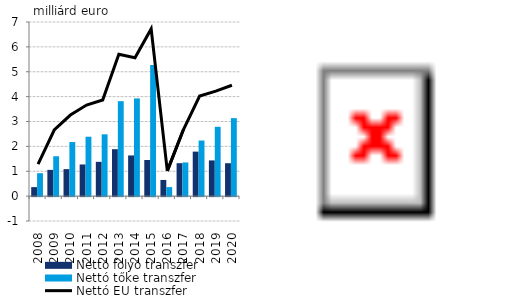
| Category | Nettó folyó transzfer | Nettó tőke transzfer |
|---|---|---|
| 2008.0 | 0.362 | 0.921 |
| 2009.0 | 1.055 | 1.603 |
| 2010.0 | 1.085 | 2.174 |
| 2011.0 | 1.273 | 2.387 |
| 2012.0 | 1.378 | 2.484 |
| 2013.0 | 1.887 | 3.817 |
| 2014.0 | 1.635 | 3.928 |
| 2015.0 | 1.452 | 5.271 |
| 2016.0 | 0.65 | 0.363 |
| 2017.0 | 1.325 | 1.353 |
| 2018.0 | 1.789 | 2.235 |
| 2019.0 | 1.435 | 2.787 |
| 2020.0 | 1.323 | 3.135 |